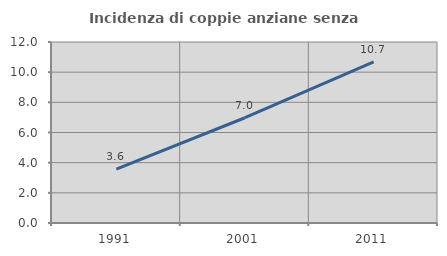
| Category | Incidenza di coppie anziane senza figli  |
|---|---|
| 1991.0 | 3.574 |
| 2001.0 | 6.978 |
| 2011.0 | 10.686 |